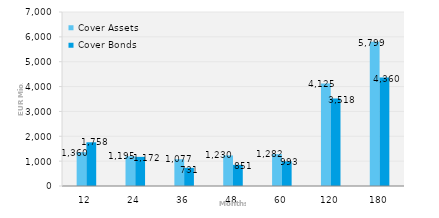
| Category | Cover Assets | Cover Bonds |
|---|---|---|
| 12.0 | 1360.419 | 1757.681 |
| 24.0 | 1194.677 | 1172.102 |
| 36.0 | 1076.564 | 730.7 |
| 48.0 | 1230.021 | 851.274 |
| 60.0 | 1282.128 | 992.627 |
| 120.0 | 4124.838 | 3517.536 |
| 180.0 | 5799.387 | 4360.258 |